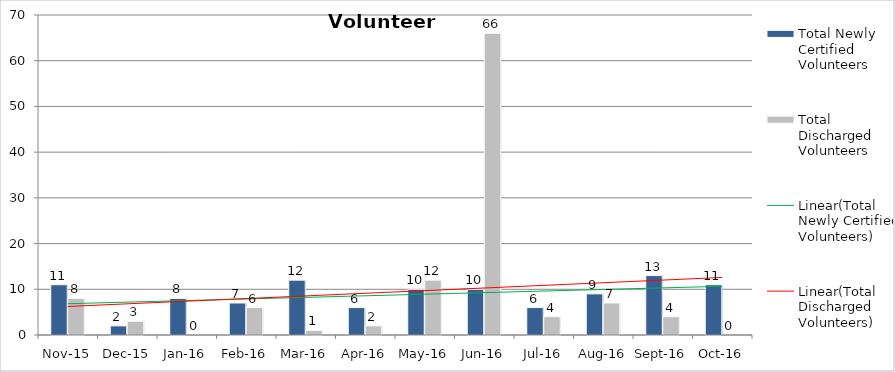
| Category | Total Newly Certified Volunteers | Total Discharged Volunteers |
|---|---|---|
| Nov-15 | 11 | 8 |
| Dec-15 | 2 | 3 |
| Jan-16 | 8 | 0 |
| Feb-16 | 7 | 6 |
| Mar-16 | 12 | 1 |
| Apr-16 | 6 | 2 |
| May-16 | 10 | 12 |
| Jun-16 | 10 | 66 |
| Jul-16 | 6 | 4 |
| Aug-16 | 9 | 7 |
| Sep-16 | 13 | 4 |
| Oct-16 | 11 | 0 |